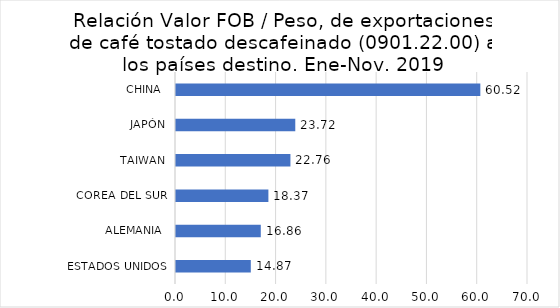
| Category | Series 0 |
|---|---|
| ESTADOS UNIDOS | 14.875 |
| ALEMANIA  | 16.86 |
| COREA DEL SUR | 18.374 |
| TAIWAN | 22.756 |
| JAPÓN | 23.721 |
| CHINA  | 60.521 |